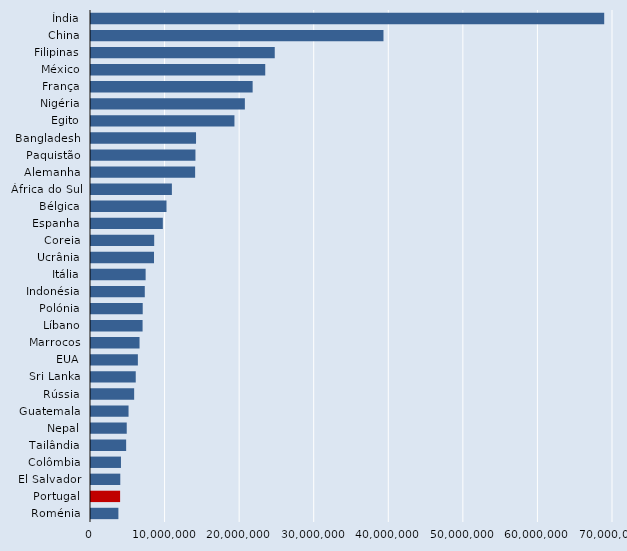
| Category | Series 2 |
|---|---|
| Índia | 68820517.838 |
| China | 39221093.635 |
| Filipinas | 24641000 |
| México | 23365990.957 |
| França | 21675866.214 |
| Nigéria | 20633319.234 |
| Egito | 19236400 |
| Bangladesh | 14084934.468 |
| Paquistão | 14007002 |
| Alemanha | 13963678.615 |
| África do Sul | 10846552.759 |
| Bélgica | 10123473.137 |
| Espanha | 9633131.333 |
| Coreia | 8474000 |
| Ucrânia | 8449000 |
| Itália | 7326336.256 |
| Indonésia | 7212196.578 |
| Polónia | 6935000 |
| Líbano | 6918082.441 |
| Marrocos | 6507907.642 |
| EUA | 6285000 |
| Sri Lanka | 5999552.324 |
| Rússia | 5787700 |
| Guatemala | 5034519 |
| Nepal | 4793419.078 |
| Tailândia | 4713380.624 |
| Colômbia | 4018674.668 |
| El Salvador | 3927280.056 |
| Portugal | 3903787.521 |
| Roménia | 3674000 |